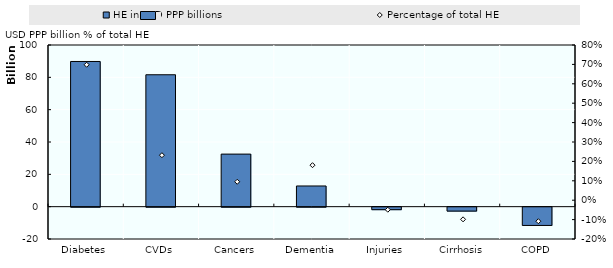
| Category | HE in USD PPP billions |
|---|---|
| Diabetes | 89808996790.297 |
| CVDs | 81592108498.81 |
| Cancers | 32517246287.534 |
| Dementia | 12793271133.8 |
| Injuries | -1550787776.482 |
| Cirrhosis | -2436795222.806 |
| COPD | -11309445619.016 |